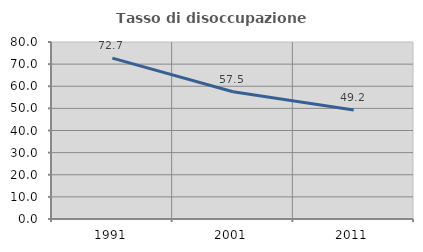
| Category | Tasso di disoccupazione giovanile  |
|---|---|
| 1991.0 | 72.698 |
| 2001.0 | 57.525 |
| 2011.0 | 49.231 |